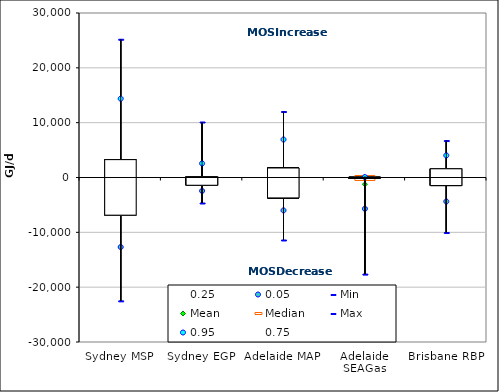
| Category | 0.25 | 0.05 | Min | Mean | Median | Max | 0.95 | 0.75 |
|---|---|---|---|---|---|---|---|---|
| Sydney MSP | -6868 | -12683.25 | -22495 | -1132.667 | -2169.5 | 25212 | 14376.75 | 3257.5 |
| Sydney EGP | -1414.053 | -2442.294 | -4648.846 | -209.422 | -386.05 | 10121.312 | 2564.565 | 161.68 |
| Adelaide MAP | -3718.75 | -5999.35 | -11397 | -654.167 | -1364 | 12028 | 6928.2 | 1734.5 |
| Adelaide SEAGas | -183.5 | -5706.25 | -17616 | -1227.7 | 1 | 196 | 87.7 | 39.75 |
| Brisbane RBP | -1465 | -4376.05 | -10035 | -161.933 | -29 | 6739 | 4029.45 | 1587.25 |